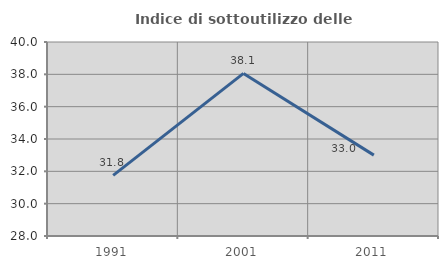
| Category | Indice di sottoutilizzo delle abitazioni  |
|---|---|
| 1991.0 | 31.75 |
| 2001.0 | 38.055 |
| 2011.0 | 33.004 |